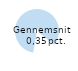
| Category | Andel af indlån (pct.) |
|---|---|
| Almindelige indlån med nulrente | 39.543 |
| Almindelige indlån med positiv rente | 22.914 |
| Indlån med binding | 11.684 |
| Udlånsrelaterede indlån | 8.869 |
| Puljeordninger | 16.991 |